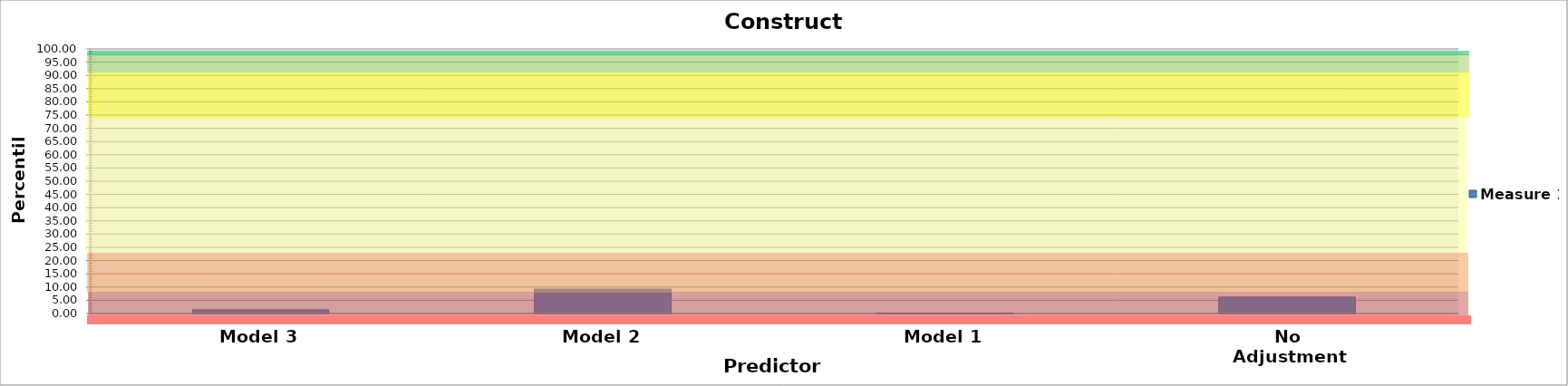
| Category | Measure 1 |
|---|---|
| 0 | 1.387 |
| 1 | 9.19 |
| 2 | 0.199 |
| 3 | 6.197 |